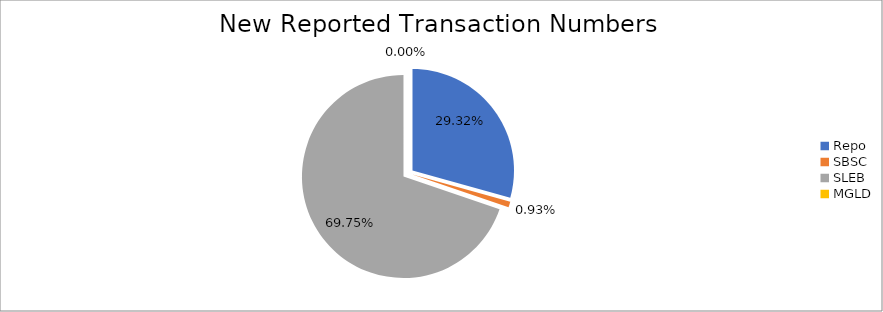
| Category | Series 0 |
|---|---|
| Repo | 295136 |
| SBSC | 9346 |
| SLEB | 702148 |
| MGLD | 40 |